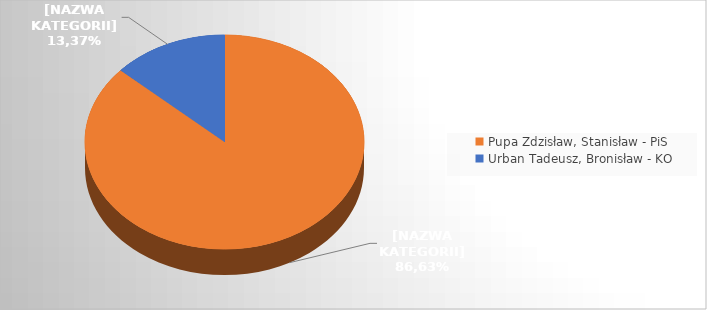
| Category | Series 0 |
|---|---|
| Pupa Zdzisław, Stanisław - PiS | 0.866 |
| Urban Tadeusz, Bronisław - KO | 0.134 |